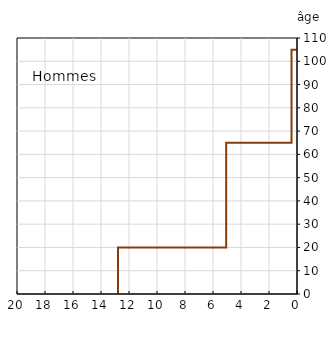
| Category | Hommes |
|---|---|
| -12.785820895522388 | 0 |
| -12.785820895522388 | 20 |
| -5.05804311774461 | 20 |
| -5.05804311774461 | 65 |
| -0.39179104477611937 | 65 |
| -0.39179104477611937 | 105 |
| 0.0 | 105 |